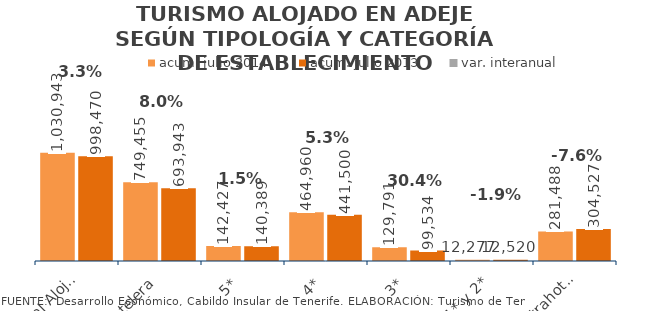
| Category | acum. julio 2014 | acum. julio 2013 |
|---|---|---|
| Total Alojados | 1030943 | 998470 |
| Hotelera | 749455 | 693943 |
| 5* | 142427 | 140389 |
| 4* | 464960 | 441500 |
| 3* | 129791 | 99534 |
| 1* y 2* | 12277 | 12520 |
| Extrahotelera | 281488 | 304527 |